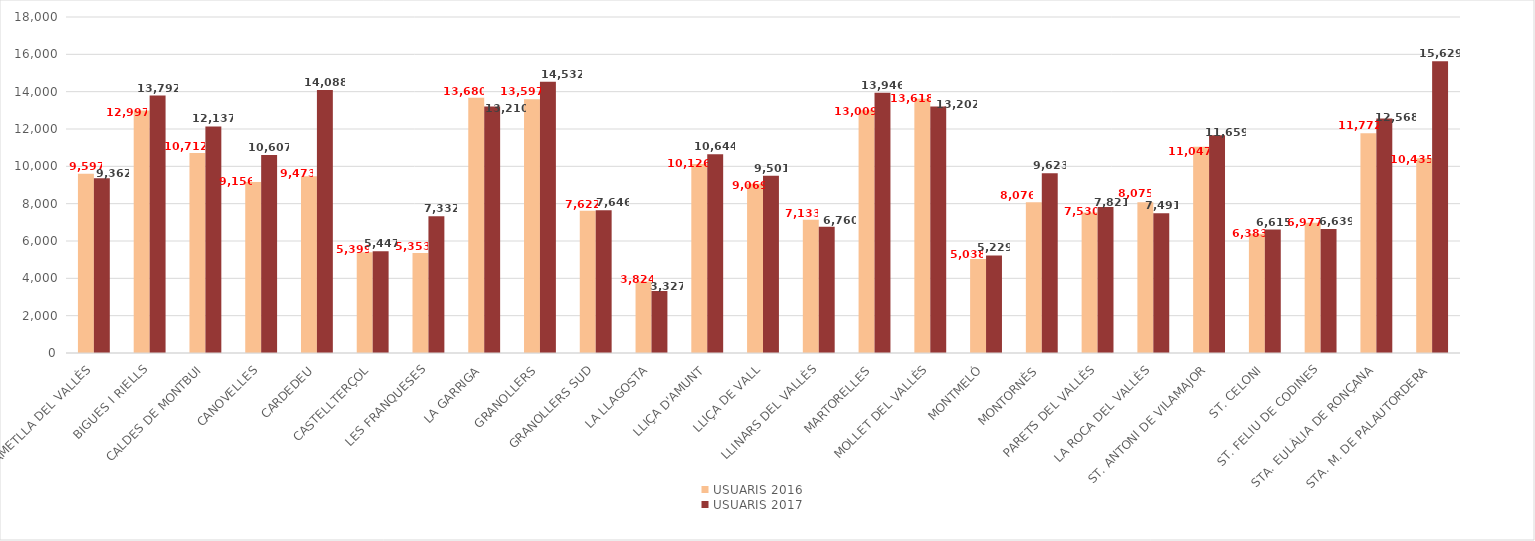
| Category | USUARIS 2016 | USUARIS 2017 |
|---|---|---|
| L'AMETLLA DEL VALLÈS | 9597 | 9362 |
| BIGUES I RIELLS | 12997 | 13792 |
| CALDES DE MONTBUI | 10712 | 12137 |
| CANOVELLES | 9156 | 10607 |
| CARDEDEU | 9473 | 14088 |
| CASTELLTERÇOL | 5399 | 5447 |
| LES FRANQUESES | 5353 | 7332 |
| LA GARRIGA | 13680 | 13210 |
| GRANOLLERS | 13597 | 14532 |
| GRANOLLERS SUD | 7622 | 7646 |
| LA LLAGOSTA | 3824 | 3327 |
| LLIÇA D'AMUNT | 10126 | 10644 |
| LLIÇA DE VALL | 9069 | 9501 |
| LLINARS DEL VALLÈS | 7133 | 6760 |
| MARTORELLES | 13009 | 13946 |
| MOLLET DEL VALLÈS | 13618 | 13202 |
| MONTMELÓ | 5038 | 5229 |
| MONTORNÈS | 8076 | 9623 |
| PARETS DEL VALLÈS | 7530 | 7821 |
| LA ROCA DEL VALLÈS | 8075 | 7491 |
| ST. ANTONI DE VILAMAJOR | 11047 | 11659 |
| ST. CELONI | 6383 | 6615 |
| ST. FELIU DE CODINES | 6977 | 6639 |
| STA. EULÀLIA DE RONÇANA | 11772 | 12568 |
| STA. M. DE PALAUTORDERA | 10435 | 15629 |